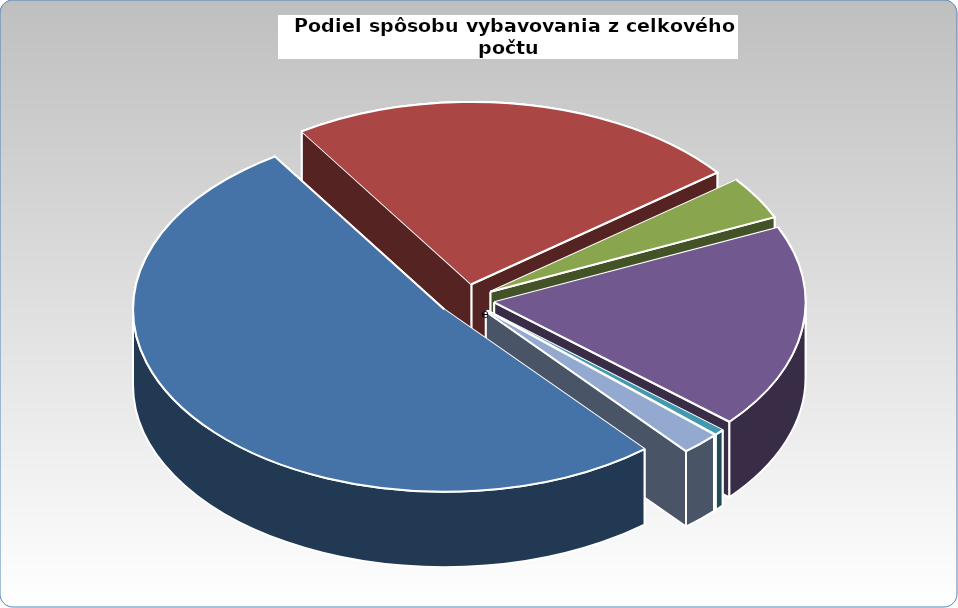
| Category | Series 0 |
|---|---|
| vyhovené úplne | 40746 |
| vyhovené čiastočne | 18556 |
| zmier | 2971 |
| návrh zamietnutý | 14187 |
| inak | 415 |
| zmier - mediácia* | 10 |
| žaloba vzatá späť | 1549 |